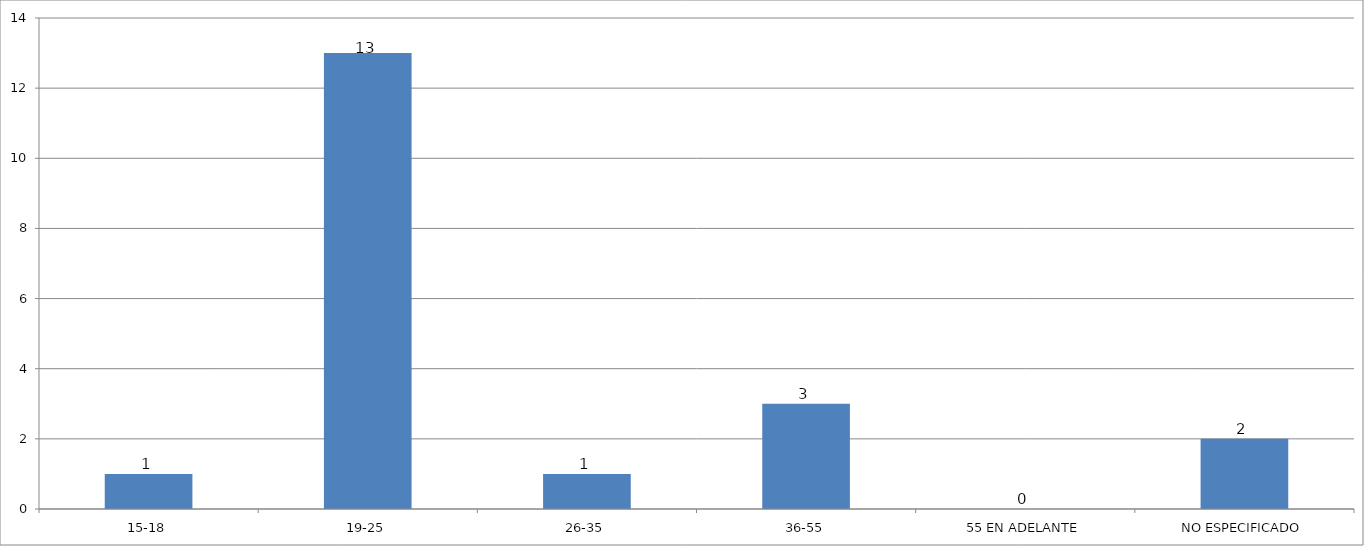
| Category | Series 0 |
|---|---|
| 15-18 | 1 |
| 19-25 | 13 |
| 26-35 | 1 |
| 36-55 | 3 |
| 55 EN ADELANTE | 0 |
| NO ESPECIFICADO | 2 |